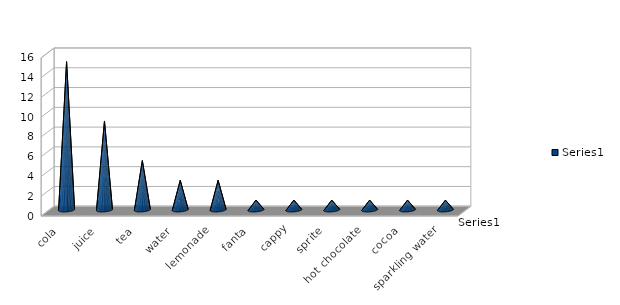
| Category | Series 0 |
|---|---|
| cola | 15 |
| juice | 9 |
| tea | 5 |
| water | 3 |
| lemonade | 3 |
| fanta | 1 |
| cappy | 1 |
| sprite | 1 |
| hot chocolate | 1 |
| cocoa | 1 |
| sparkling water | 1 |